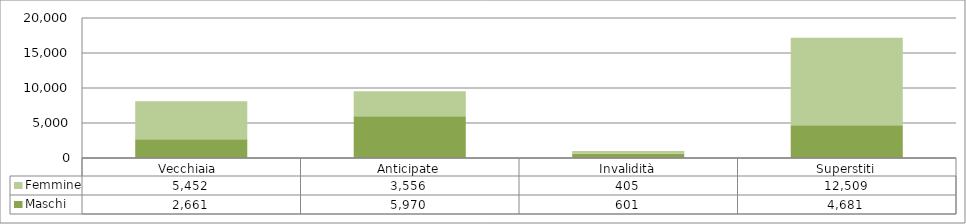
| Category | Maschi | Femmine |
|---|---|---|
| Vecchiaia  | 2661 | 5452 |
| Anticipate | 5970 | 3556 |
| Invalidità | 601 | 405 |
| Superstiti | 4681 | 12509 |